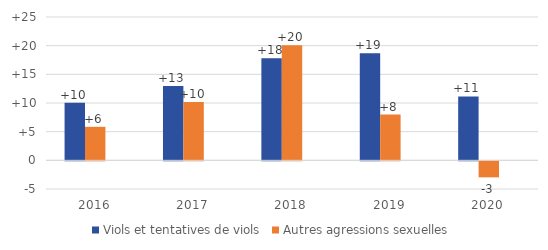
| Category | Viols et tentatives de viols | Autres agressions sexuelles | Series 2 |
|---|---|---|---|
| 2016.0 | 10.032 | 5.844 |  |
| 2017.0 | 12.946 | 10.194 |  |
| 2018.0 | 17.789 | 20.077 |  |
| 2019.0 | 18.662 | 7.983 |  |
| 2020.0 | 11.151 | -2.792 |  |